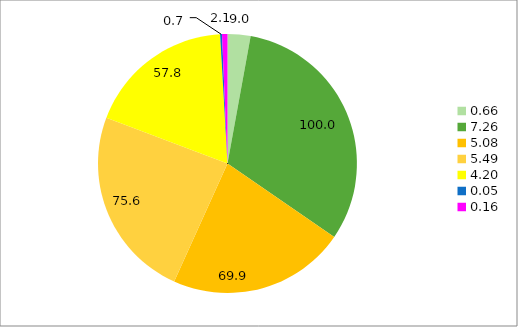
| Category | Series 0 |
|---|---|
| 0.6559925093632959 | 9.031 |
| 7.263609176029963 | 100 |
| 5.076135189946273 | 69.884 |
| 5.494264029371918 | 75.641 |
| 4.198277025732683 | 57.799 |
| 0.053443636767449385 | 0.736 |
| 0.15547945205479455 | 2.141 |